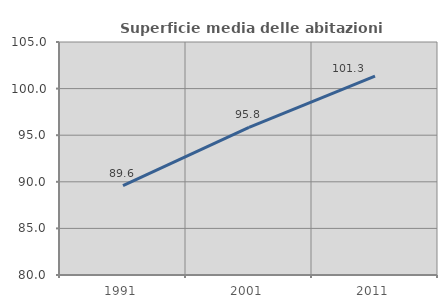
| Category | Superficie media delle abitazioni occupate |
|---|---|
| 1991.0 | 89.589 |
| 2001.0 | 95.832 |
| 2011.0 | 101.337 |